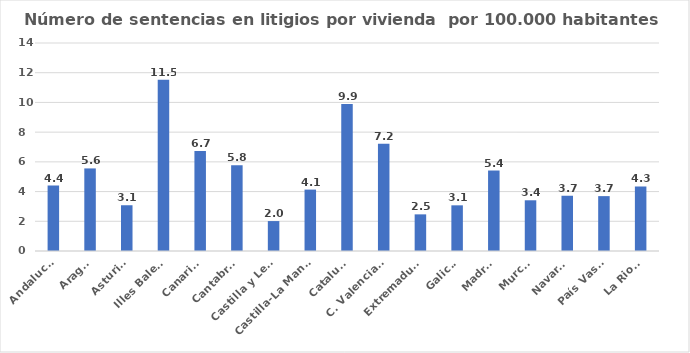
| Category | Número de sentencias en litigios por vivienda  por 100.000 habitantes |
|---|---|
| Andalucía | 4.402 |
| Aragón | 5.558 |
| Asturias | 3.08 |
| Illes Balears | 11.519 |
| Canarias | 6.733 |
| Cantabria | 5.777 |
| Castilla y León | 2.015 |
| Castilla-La Mancha | 4.133 |
| Cataluña | 9.887 |
| C. Valenciana | 7.225 |
| Extremadura | 2.466 |
| Galicia | 3.074 |
| Madrid | 5.417 |
| Murcia | 3.413 |
| Navarra | 3.719 |
| País Vasco | 3.694 |
| La Rioja | 4.344 |